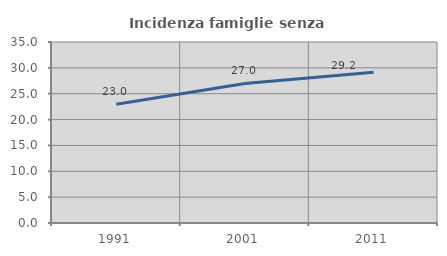
| Category | Incidenza famiglie senza nuclei |
|---|---|
| 1991.0 | 22.951 |
| 2001.0 | 26.993 |
| 2011.0 | 29.173 |